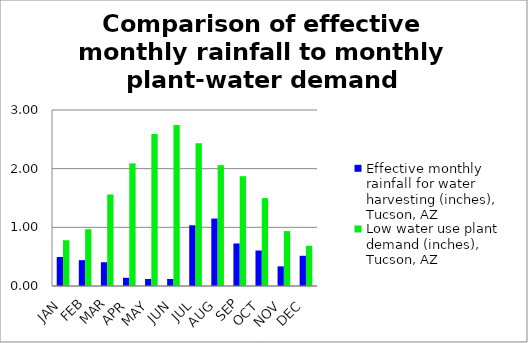
| Category | Effective monthly rainfall for water harvesting (inches), Tucson, AZ  | Low water use plant demand (inches), Tucson, AZ  |
|---|---|---|
| JAN | 0.495 | 0.78 |
| FEB | 0.44 | 0.967 |
| MAR | 0.405 | 1.56 |
| APR | 0.14 | 2.09 |
| MAY | 0.12 | 2.59 |
| JUN | 0.12 | 2.746 |
| JUL | 1.035 | 2.434 |
| AUG | 1.15 | 2.059 |
| SEP | 0.725 | 1.872 |
| OCT | 0.605 | 1.498 |
| NOV | 0.335 | 0.936 |
| DEC | 0.515 | 0.686 |